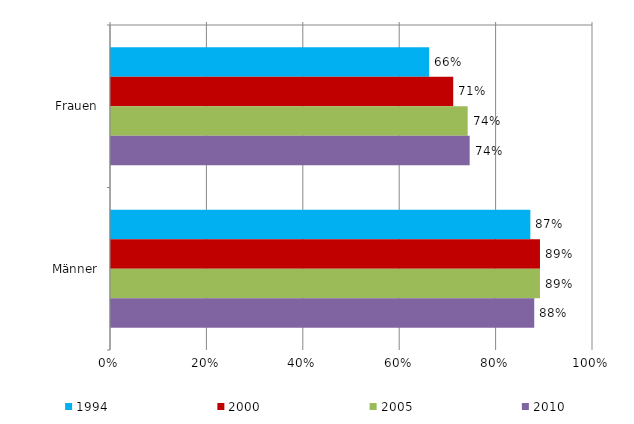
| Category | 1994 | 2000 | 2005 | 2010 |
|---|---|---|---|---|
| Frauen | 66 | 71 | 74 | 74.415 |
| Männer | 87 | 89 | 89 | 87.809 |